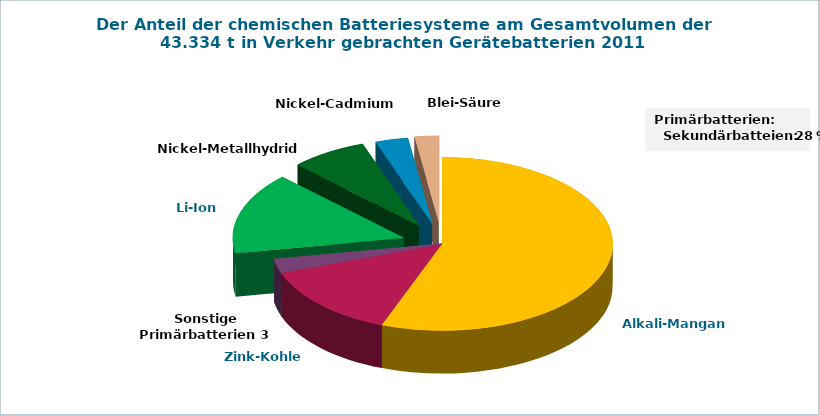
| Category | Series 0 |
|---|---|
|  Alkali-Mangan | 55.757 |
|  Zink-Kohle | 13.805 |
|  | 2.64 |
| Li-Ion  | 15.271 |
| Nickel-Metallhydrid | 7.219 |
| Nickel-Cadmium | 3.08 |
| Blei-Säure | 2.286 |